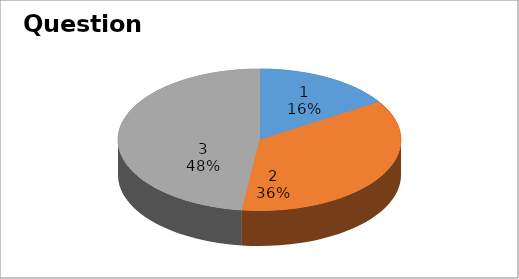
| Category | Series 0 |
|---|---|
| 0 | 4 |
| 1 | 9 |
| 2 | 12 |